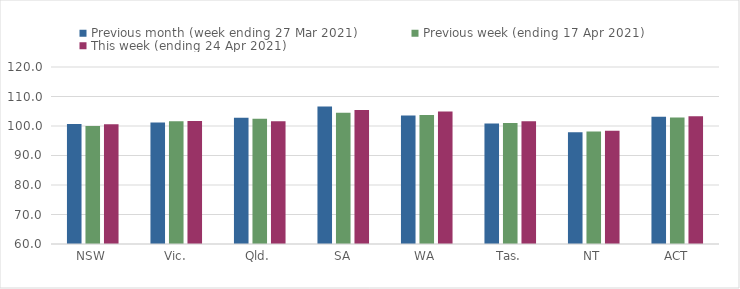
| Category | Previous month (week ending 27 Mar 2021) | Previous week (ending 17 Apr 2021) | This week (ending 24 Apr 2021) |
|---|---|---|---|
| NSW | 100.67 | 99.99 | 100.63 |
| Vic. | 101.16 | 101.59 | 101.73 |
| Qld. | 102.78 | 102.44 | 101.64 |
| SA | 106.62 | 104.53 | 105.4 |
| WA | 103.53 | 103.71 | 104.89 |
| Tas. | 100.86 | 101.05 | 101.57 |
| NT | 97.88 | 98.15 | 98.36 |
| ACT | 103.12 | 102.91 | 103.3 |